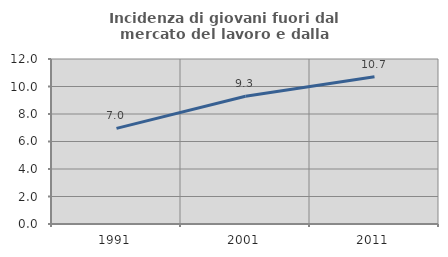
| Category | Incidenza di giovani fuori dal mercato del lavoro e dalla formazione  |
|---|---|
| 1991.0 | 6.952 |
| 2001.0 | 9.29 |
| 2011.0 | 10.714 |